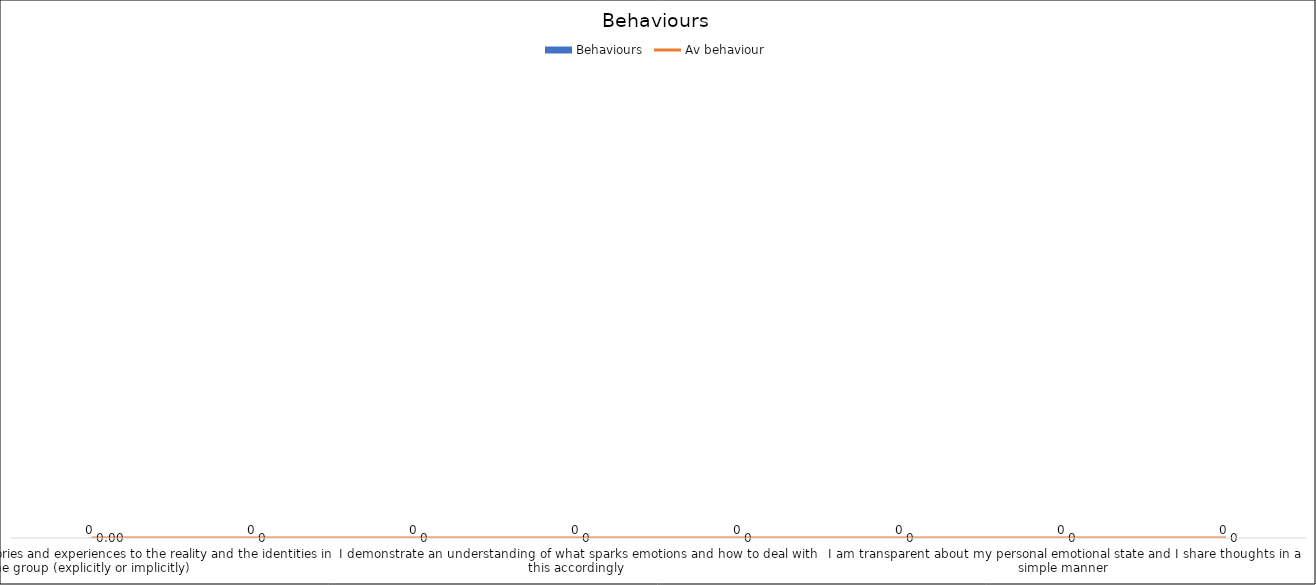
| Category | Behaviours |
|---|---|
| I match knowledge, theories and experiences to the reality and the identities in the group (explicitly or implicitly)  | 0 |
| I listen carefully to others, without judgement, interruption and, if possible, in an unbiased manner | 0 |
| I am attentive to body language | 0 |
| I demonstrate an understanding of what sparks emotions and how to deal with this accordingly  | 0 |
| I am able to identify feelings and emotions and understand their impact on others | 0 |
| I address others’ unexpressed concerns, feelings, or interests  | 0 |
| I am transparent about my personal emotional state and I share thoughts in a simple manner | 0 |
| I create a safe environment where feelings and emotions can be freely and respectfully expressed | 0 |